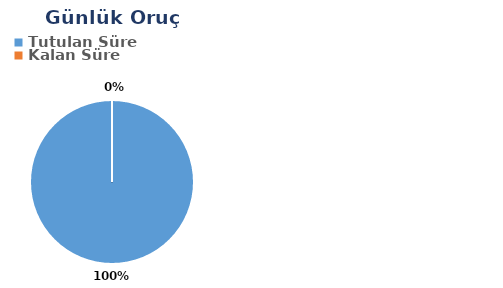
| Category | Günlük |
|---|---|
| Tutulan Süre | 0.59 |
| Kalan Süre | 0 |